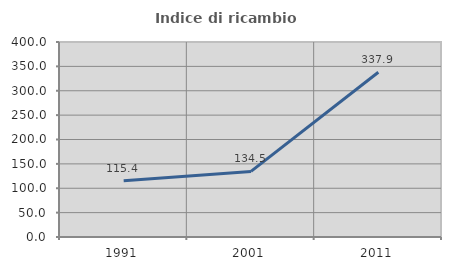
| Category | Indice di ricambio occupazionale  |
|---|---|
| 1991.0 | 115.447 |
| 2001.0 | 134.513 |
| 2011.0 | 337.879 |